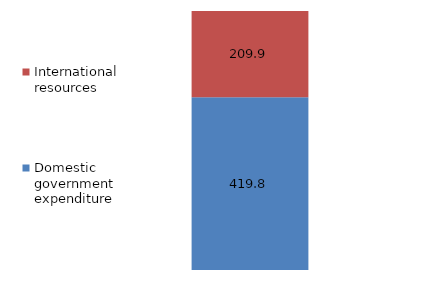
| Category | Domestic government expenditure | International resources |
|---|---|---|
| 0 | 419.77 | 209.853 |